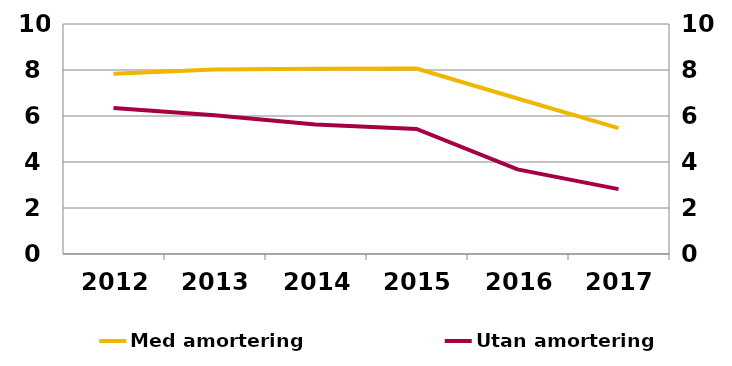
| Category | Med amortering |
|---|---|
| 2012-12-31 | 7.84 |
| 2013-12-31 | 8.02 |
| 2014-12-31 | 8.05 |
| 2015-12-31 | 8.06 |
| 2016-12-31 | 6.76 |
| 2017-12-31 | 5.47 |